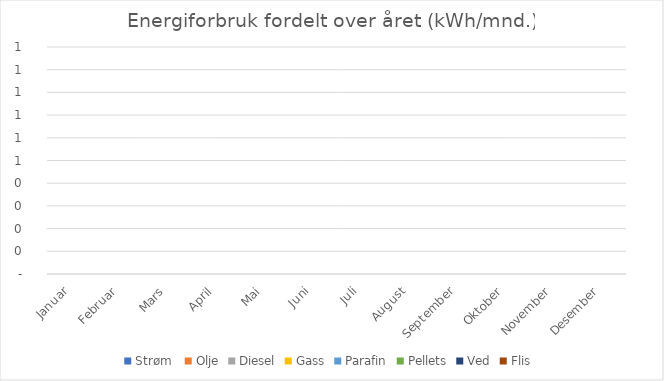
| Category | Strøm  | Olje | Diesel | Gass | Parafin | Pellets | Ved | Flis  |
|---|---|---|---|---|---|---|---|---|
| Januar | 0 | 0 | 0 | 0 | 0 | 0 | 0 | 0 |
| Februar | 0 | 0 | 0 | 0 | 0 | 0 | 0 | 0 |
| Mars | 0 | 0 | 0 | 0 | 0 | 0 | 0 | 0 |
| April | 0 | 0 | 0 | 0 | 0 | 0 | 0 | 0 |
| Mai | 0 | 0 | 0 | 0 | 0 | 0 | 0 | 0 |
| Juni | 0 | 0 | 0 | 0 | 0 | 0 | 0 | 0 |
| Juli | 0 | 0 | 0 | 0 | 0 | 0 | 0 | 0 |
| August | 0 | 0 | 0 | 0 | 0 | 0 | 0 | 0 |
| September | 0 | 0 | 0 | 0 | 0 | 0 | 0 | 0 |
| Oktober | 0 | 0 | 0 | 0 | 0 | 0 | 0 | 0 |
| November | 0 | 0 | 0 | 0 | 0 | 0 | 0 | 0 |
| Desember | 0 | 0 | 0 | 0 | 0 | 0 | 0 | 0 |